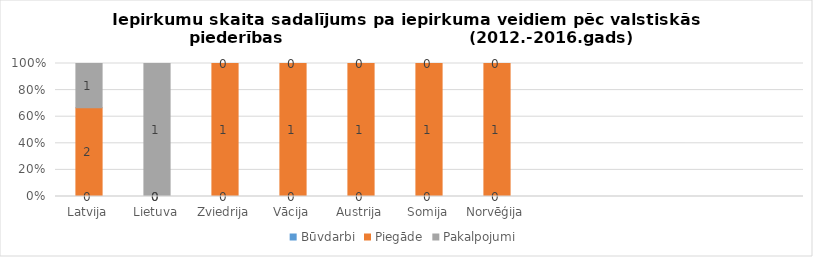
| Category | Būvdarbi | Piegāde | Pakalpojumi |
|---|---|---|---|
| Latvija | 0 | 2 | 1 |
| Lietuva | 0 | 0 | 1 |
| Zviedrija | 0 | 1 | 0 |
| Vācija | 0 | 1 | 0 |
| Austrija | 0 | 1 | 0 |
| Somija | 0 | 1 | 0 |
| Norvēģija | 0 | 1 | 0 |